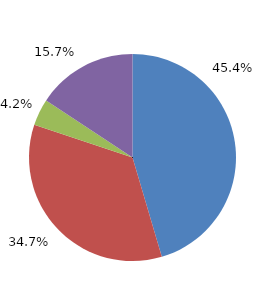
| Category | 2017 |
|---|---|
| Vorl.güter/Energie | 16118.855 |
| Investitionsgüterproduzenten | 12302.388 |
| Gebrauchsgüterproduzenten | 1485.623 |
| Verbrauchsgüterproduzenten | 5573.31 |